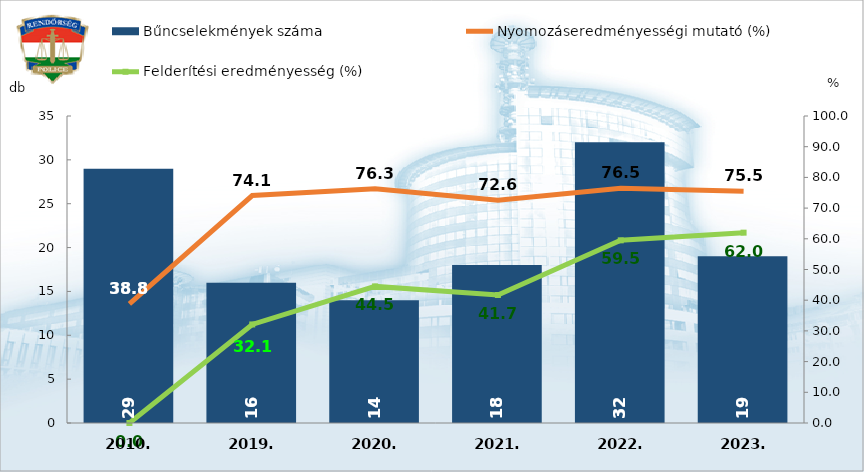
| Category | Bűncselekmények száma |
|---|---|
| 2010. | 29 |
| 2019. | 16 |
| 2020. | 14 |
| 2021. | 18 |
| 2022. | 32 |
| 2023. | 19 |